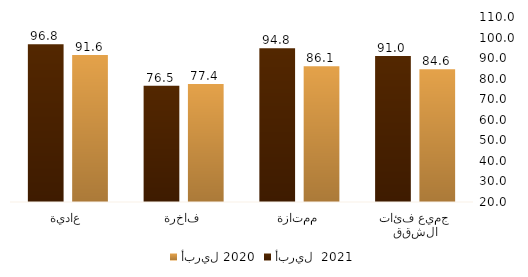
| Category | أبريل 2020 | أبريل  2021 |
|---|---|---|
| جميع فئات الشقق | 84.596 | 90.996 |
| ممتازة | 86.083 | 94.802 |
| فاخرة | 77.397 | 76.528 |
| عادية | 91.571 | 96.772 |